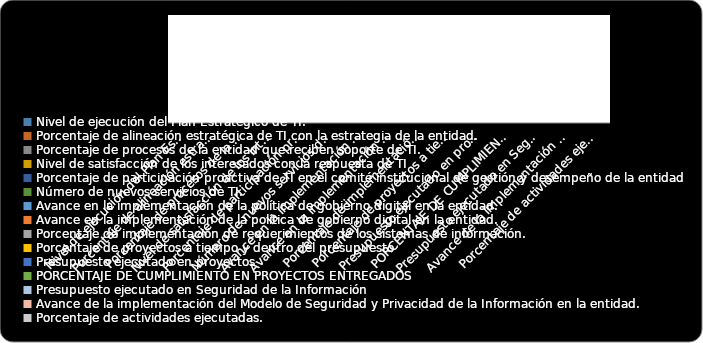
| Category | % Cumplimiento  |
|---|---|
| Nivel de ejecución del Plan Estratégico de TI. | 0 |
| Porcentaje de alineación estratégica de TI con la estrategia de la entidad. | 0 |
| Porcentaje de procesos de la entidad que reciben soporte de TI. | 0 |
| Nivel de satisfacción de los interesados con la respuesta de TI | 0 |
| Porcentaje de participación proactiva de TI en el comité institucional de gestión y desempeño de la entidad | 0 |
| Número de nuevos servicios de TI. | 0 |
| Avance en la implementación de la política de gobierno digital en la entidad. | 0 |
| Avance en la implementación de la política de gobierno digital en la entidad. | 0 |
| Porcentaje de implementación de requerimientos de los sistemas de información. | 0 |
| Porcentaje de proyectos a tiempo y dentro del presupuesto | 0 |
| Presupuesto ejecutado en proyectos | 0 |
| PORCENTAJE DE CUMPLIMIENTO EN PROYECTOS ENTREGADOS | 0 |
| Presupuesto ejecutado en Seguridad de la Información  | 0 |
| Avance de la implementación del Modelo de Seguridad y Privacidad de la Información en la entidad. | 0 |
| Porcentaje de actividades ejecutadas. | 0 |